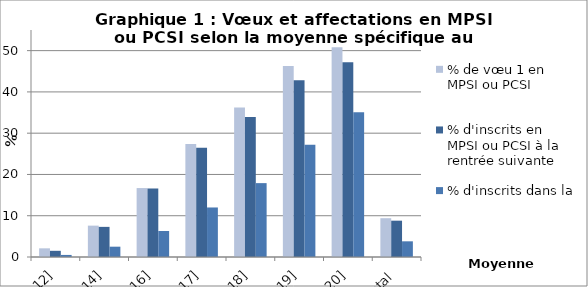
| Category | % de vœu 1 en MPSI ou PCSI | % d'inscrits en MPSI ou PCSI à la rentrée suivante | % d'inscrits dans la CPGE du vœu 1 à la rentrée suivante |
|---|---|---|---|
| (0,12] | 2.1 | 1.5 | 0.5 |
| (12,14] | 7.6 | 7.3 | 2.5 |
| (14,16] | 16.7 | 16.6 | 6.3 |
| (16,17] | 27.4 | 26.5 | 12 |
| (17,18] | 36.2 | 33.9 | 17.9 |
| (18,19] | 46.3 | 42.8 | 27.2 |
| (19,20] | 50.8 | 47.2 | 35.1 |
| Total | 9.4 | 8.8 | 3.8 |